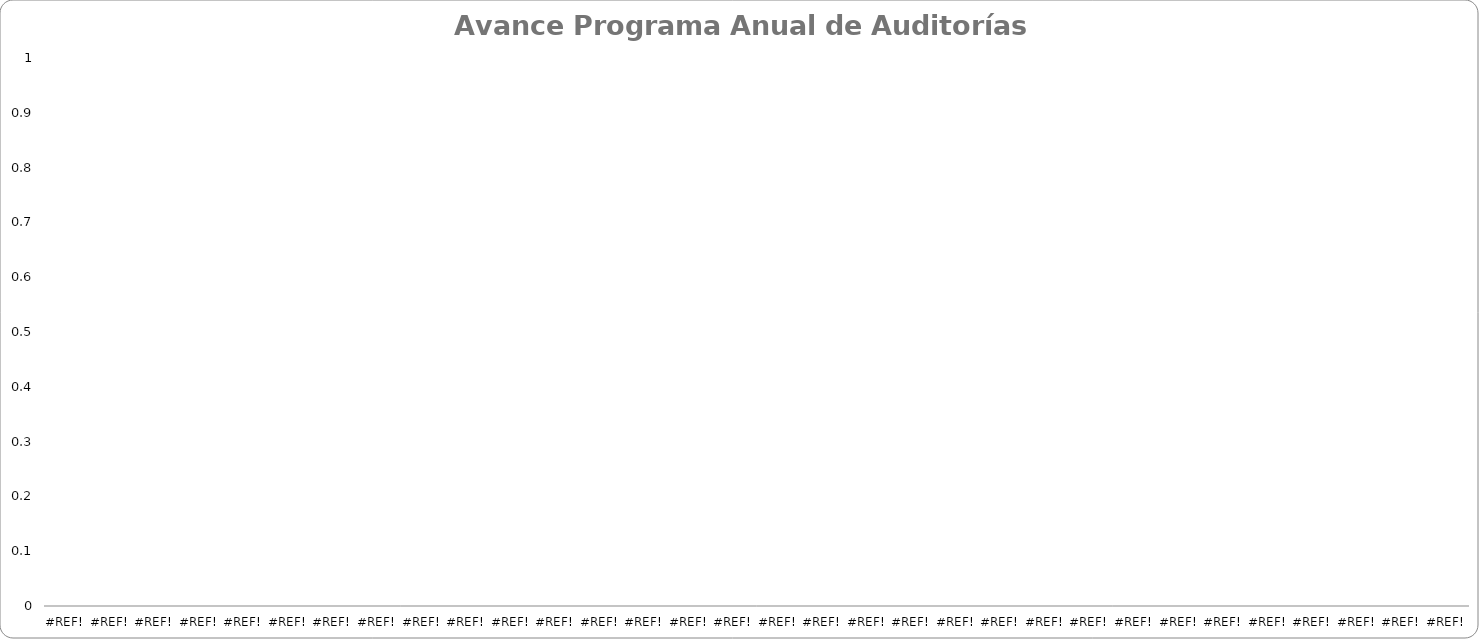
| Category | META | AVANCE | % DE CUMPLIMIENTO |
|---|---|---|---|
| 0.0 | 0 | 0 | 0 |
| 0.0 | 0 | 0 | 0 |
| 0.0 | 0 | 0 | 0 |
| 0.0 | 0 | 0 | 0 |
| 0.0 | 0 | 0 | 0 |
| 0.0 | 0 | 0 | 0 |
| 0.0 | 0 | 0 | 0 |
| 0.0 | 0 | 0 | 0 |
| 0.0 | 0 | 0 | 0 |
| 0.0 | 0 | 0 | 0 |
| 0.0 | 0 | 0 | 0 |
| 0.0 | 0 | 0 | 0 |
| 0.0 | 0 | 0 | 0 |
| 0.0 | 0 | 0 | 0 |
| 0.0 | 0 | 0 | 0 |
| 0.0 | 0 | 0 | 0 |
| 0.0 | 0 | 0 | 0 |
| 0.0 | 0 | 0 | 0 |
| 0.0 | 0 | 0 | 0 |
| 0.0 | 0 | 0 | 0 |
| 0.0 | 0 | 0 | 0 |
| 0.0 | 0 | 0 | 0 |
| 0.0 | 0 | 0 | 0 |
| 0.0 | 0 | 0 | 0 |
| 0.0 | 0 | 0 | 0 |
| 0.0 | 0 | 0 | 0 |
| 0.0 | 0 | 0 | 0 |
| 0.0 | 0 | 0 | 0 |
| 0.0 | 0 | 0 | 0 |
| 0.0 | 0 | 0 | 0 |
| 0.0 | 0 | 0 | 0 |
| 0.0 | 0 | 0 | 0 |